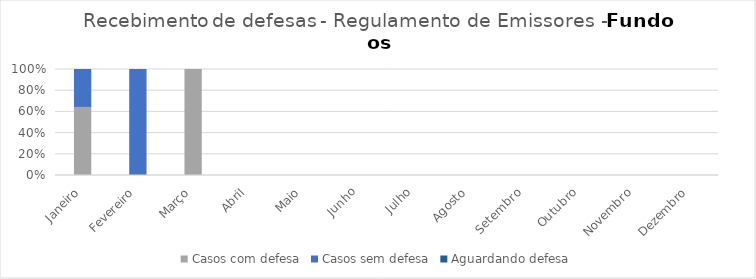
| Category | Casos com defesa | Casos sem defesa | Aguardando defesa |
|---|---|---|---|
| Janeiro | 15 | 8 | 0 |
| Fevereiro | 0 | 2 | 0 |
| Março | 4 | 0 | 0 |
| Abril | 0 | 0 | 0 |
| Maio | 0 | 0 | 0 |
| Junho | 0 | 0 | 0 |
| Julho | 0 | 0 | 0 |
| Agosto | 0 | 0 | 0 |
| Setembro | 0 | 0 | 0 |
| Outubro | 0 | 0 | 0 |
| Novembro | 0 | 0 | 0 |
| Dezembro | 0 | 0 | 0 |